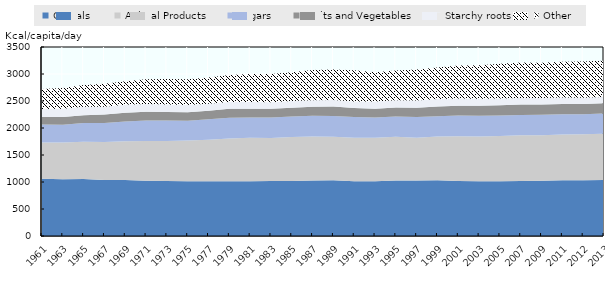
| Category | Cereals  | Animal Products | Sugars | Fruits and Vegetables | Starchy roots | Other |
|---|---|---|---|---|---|---|
| 1961.0 | 1060.8 | 672.098 | 329.927 | 138.854 | 152.39 | 366.131 |
| 1963.0 | 1050.83 | 679.854 | 330.634 | 141.512 | 153.756 | 383.704 |
| 1965.0 | 1054.78 | 689 | 347.317 | 146.366 | 155.366 | 405.731 |
| 1967.0 | 1035.49 | 704.464 | 353.537 | 154.781 | 147.146 | 425.652 |
| 1969.0 | 1036.85 | 717.732 | 365.805 | 162.049 | 147.756 | 436.828 |
| 1971.0 | 1023.41 | 737.829 | 377.415 | 162.707 | 144.537 | 456.731 |
| 1973.0 | 1019.49 | 738.048 | 382.634 | 158.268 | 137.707 | 471.853 |
| 1975.0 | 1013.73 | 754.488 | 365.512 | 160.22 | 131.024 | 478.007 |
| 1977.0 | 1011.9 | 770.951 | 379.439 | 156.658 | 131.22 | 487.222 |
| 1979.0 | 1012.15 | 792.512 | 385.659 | 165.293 | 125.756 | 501 |
| 1981.0 | 1014.17 | 803.122 | 378.268 | 159.951 | 125.976 | 519.053 |
| 1983.0 | 1018.12 | 796.707 | 378.317 | 163.512 | 119.146 | 524.998 |
| 1985.0 | 1016.66 | 814.39 | 379.61 | 166.586 | 122.098 | 533.456 |
| 1987.0 | 1027.05 | 814.805 | 386.268 | 166.39 | 121.488 | 556.388 |
| 1989.0 | 1030.29 | 808.829 | 384.585 | 172.927 | 121.902 | 564.737 |
| 1991.0 | 1015.54 | 803.122 | 383.756 | 168.464 | 118.78 | 581.138 |
| 1993.0 | 1012.71 | 805.857 | 375.082 | 164.612 | 133.184 | 542.655 |
| 1995.0 | 1027.02 | 808.653 | 375.224 | 166.633 | 134.612 | 550.918 |
| 1997.0 | 1026.53 | 792.837 | 383.918 | 171.551 | 134.592 | 575.922 |
| 1999.0 | 1031.67 | 811.469 | 376.429 | 179.694 | 137 | 582.368 |
| 2001.0 | 1019.84 | 826.726 | 383.941 | 182.823 | 131.863 | 612.807 |
| 2003.0 | 1013.71 | 829.961 | 384.98 | 185.667 | 127.529 | 619.803 |
| 2005.0 | 1013.1 | 837.216 | 383.431 | 187.863 | 123.216 | 643.394 |
| 2007.0 | 1017.06 | 850.628 | 374.431 | 191.961 | 119.784 | 657.746 |
| 2009.0 | 1023.49 | 844.451 | 376.098 | 190.745 | 118.961 | 655.455 |
| 2011.0 | 1030.69 | 850.039 | 373.451 | 190.98 | 118.569 | 664.271 |
| 2012.0 | 1033.16 | 850.766 | 372.843 | 188.157 | 116.157 | 668.817 |
| 2013.0 | 1038.25 | 853.432 | 375.608 | 192.196 | 114.392 | 670.982 |